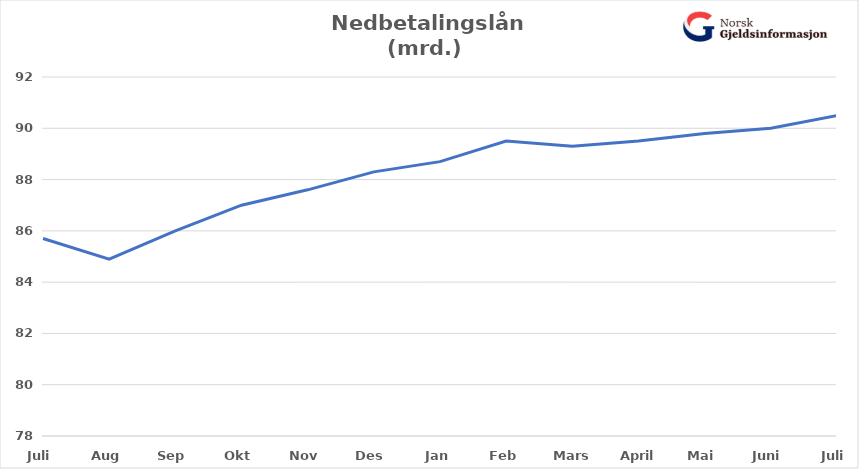
| Category | Nedbetalingslån |
|---|---|
| Juli | 85.7 |
| Aug | 84.9 |
| Sep | 86 |
| Okt | 87 |
| Nov | 87.6 |
| Des | 88.3 |
| Jan | 88.7 |
| Feb | 89.5 |
| Mars | 89.3 |
| April | 89.5 |
| Mai | 89.8 |
| Juni | 90 |
| Juli | 90.5 |